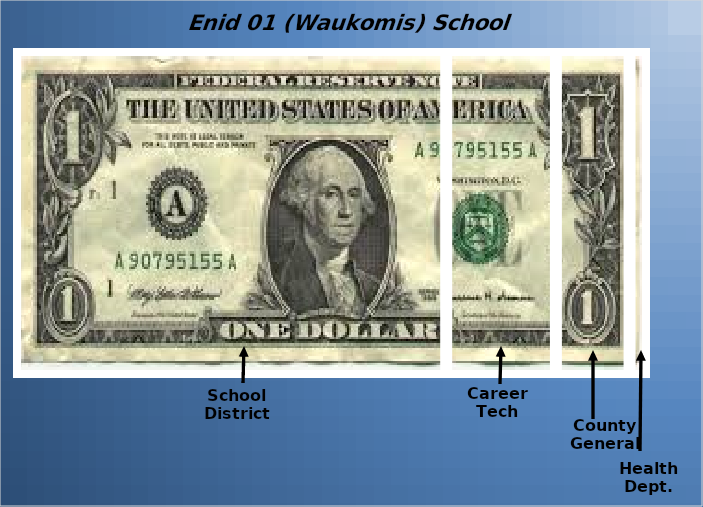
| Category | School District | Career Tech | County General | Health Dept. |
|---|---|---|---|---|
| 0 | 0.681 | 0.173 | 0.116 | 0.029 |